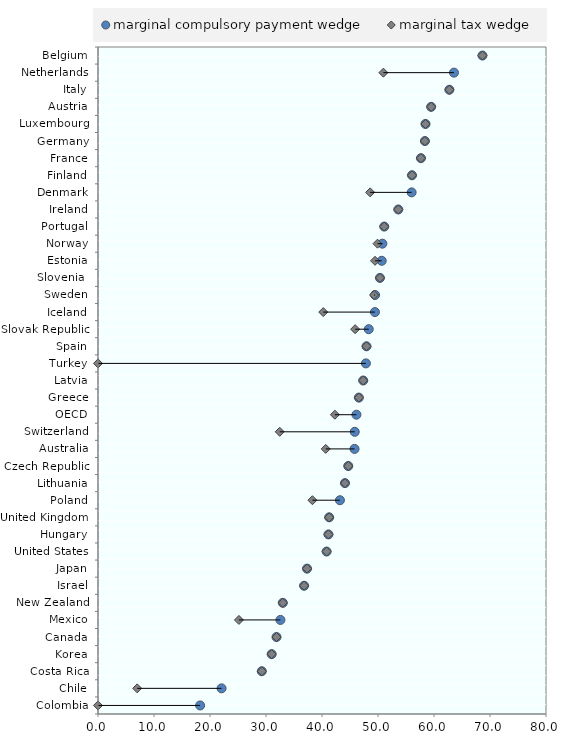
| Category | blankName |
|---|---|
| Colombia | 0 |
| Chile | 7 |
| Costa Rica | 29.249 |
| Korea | 31.01 |
| Canada | 31.878 |
| Mexico | 25.169 |
| New Zealand | 33 |
| Israel | 36.803 |
| Japan | 37.325 |
| United States | 40.827 |
| Hungary | 41.15 |
| United Kingdom | 41.278 |
| Poland | 38.285 |
| Lithuania | 44.101 |
| Czech Republic | 44.694 |
| Australia | 40.665 |
| Switzerland | 32.457 |
| OECD | 42.308 |
| Greece | 46.583 |
| Latvia | 47.357 |
| Turkey | 0 |
| Spain | 47.948 |
| Slovak Republic | 45.917 |
| Iceland | 40.228 |
| Sweden | 49.296 |
| Slovenia  | 50.348 |
| Estonia | 49.47 |
| Norway | 49.912 |
| Portugal | 51.111 |
| Ireland | 53.624 |
| Denmark | 48.597 |
| Finland | 56.068 |
| France | 57.667 |
| Germany | 58.374 |
| Luxembourg | 58.48 |
| Austria | 59.49 |
| Italy | 62.743 |
| Netherlands | 50.962 |
| Belgium | 68.651 |